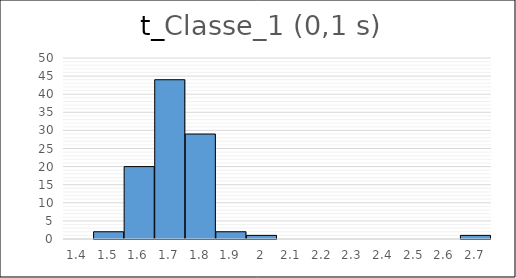
| Category | Series 0 |
|---|---|
| 1.4 | 0 |
| 1.5 | 2 |
| 1.6 | 20 |
| 1.7 | 44 |
| 1.8 | 29 |
| 1.9 | 2 |
| 2.0 | 1 |
| 2.1 | 0 |
| 2.2 | 0 |
| 2.3 | 0 |
| 2.4 | 0 |
| 2.5 | 0 |
| 2.6 | 0 |
| 2.7 | 1 |